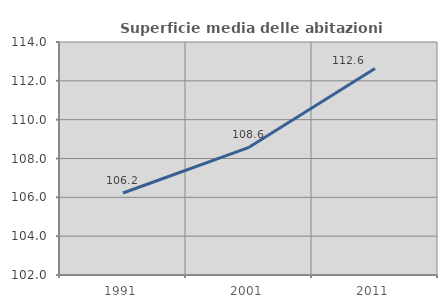
| Category | Superficie media delle abitazioni occupate |
|---|---|
| 1991.0 | 106.222 |
| 2001.0 | 108.577 |
| 2011.0 | 112.635 |